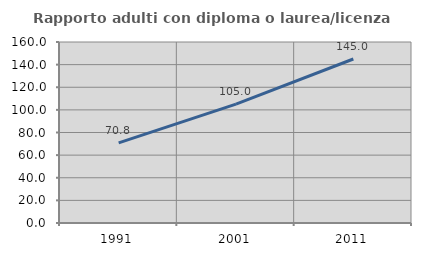
| Category | Rapporto adulti con diploma o laurea/licenza media  |
|---|---|
| 1991.0 | 70.763 |
| 2001.0 | 105.016 |
| 2011.0 | 144.986 |